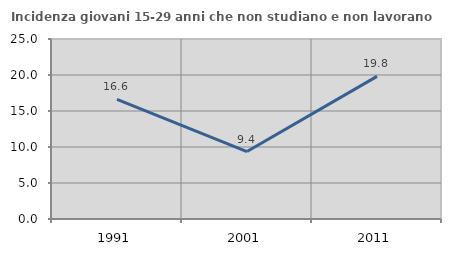
| Category | Incidenza giovani 15-29 anni che non studiano e non lavorano  |
|---|---|
| 1991.0 | 16.625 |
| 2001.0 | 9.369 |
| 2011.0 | 19.811 |